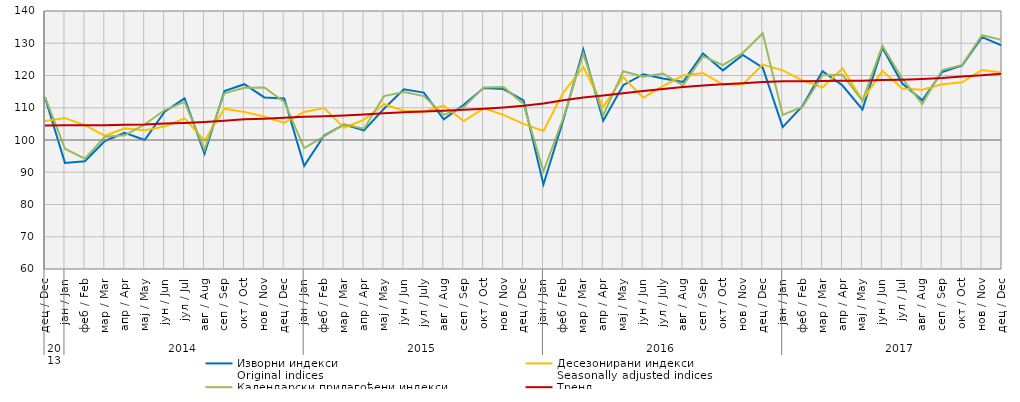
| Category | Изворни индекси
Original indices | Десезонирани индекси
Seasonally adjusted indices | Календарски прилагођени индекси
Working-day adjusted indices | Тренд
Trend |
|---|---|---|---|---|
| 0 | 113.2 | 105.9 | 113.4 | 104.5 |
| 1 | 92.9 | 106.8 | 97.3 | 104.6 |
| 2 | 93.4 | 104.6 | 94.2 | 104.6 |
| 3 | 99.7 | 101.3 | 101 | 104.6 |
| 4 | 102.2 | 103.6 | 101.5 | 104.7 |
| 5 | 100 | 103 | 104.8 | 104.8 |
| 6 | 108.8 | 104.2 | 109.3 | 105.1 |
| 7 | 112.9 | 106.7 | 111.8 | 105.3 |
| 8 | 95.8 | 99.8 | 97 | 105.6 |
| 9 | 115.2 | 109.7 | 114.5 | 106 |
| 10 | 117.3 | 108.7 | 116.2 | 106.4 |
| 11 | 113.2 | 107.3 | 116.3 | 106.6 |
| 12 | 112.9 | 105.3 | 111.8 | 106.9 |
| 13 | 92 | 108.7 | 97.5 | 107.2 |
| 14 | 101.4 | 109.9 | 101.1 | 107.4 |
| 15 | 104.8 | 103.8 | 104.9 | 107.6 |
| 16 | 103 | 106.3 | 103.5 | 107.9 |
| 17 | 109.7 | 111.1 | 113.6 | 108.3 |
| 18 | 115.7 | 109.1 | 114.9 | 108.6 |
| 19 | 114.7 | 108.8 | 113.6 | 108.8 |
| 20 | 106.4 | 110.7 | 107.8 | 109.1 |
| 21 | 110.9 | 105.9 | 110.2 | 109.4 |
| 22 | 116.1 | 109.8 | 116.3 | 109.7 |
| 23 | 115.8 | 107.8 | 116.4 | 110.1 |
| 24 | 112.3 | 105 | 111.2 | 110.6 |
| 25 | 86.2 | 102.8 | 90.3 | 111.3 |
| 26 | 106.3 | 114.8 | 106.9 | 112.3 |
| 27 | 128 | 122.6 | 126.8 | 113.2 |
| 28 | 106 | 110.3 | 107.7 | 113.8 |
| 29 | 117 | 119.5 | 121.3 | 114.5 |
| 30 | 120.4 | 113.1 | 119.6 | 115.2 |
| 31 | 119.1 | 116.7 | 120.6 | 115.8 |
| 32 | 118 | 120 | 116.9 | 116.4 |
| 33 | 126.8 | 120.8 | 126 | 116.9 |
| 34 | 121.6 | 117.2 | 123.2 | 117.3 |
| 35 | 126.4 | 117.3 | 127 | 117.6 |
| 36 | 122.4 | 123.4 | 133.1 | 118 |
| 37 | 104 | 121.6 | 107.8 | 118.2 |
| 38 | 110.6 | 118.5 | 110.3 | 118.2 |
| 39 | 121.3 | 116.3 | 120.1 | 118.3 |
| 40 | 116.9 | 122.2 | 120.2 | 118.4 |
| 41 | 109.5 | 112.3 | 112.2 | 118.4 |
| 42 | 128.6 | 121.5 | 129.2 | 118.6 |
| 43 | 117.5 | 116 | 119 | 118.7 |
| 44 | 112.3 | 115.6 | 111.2 | 118.9 |
| 45 | 121.1 | 117.3 | 121.7 | 119.2 |
| 46 | 123.1 | 117.9 | 123.3 | 119.7 |
| 47 | 131.9 | 121.7 | 132.5 | 120.1 |
| 48 | 129.3 | 120.9 | 131 | 120.6 |